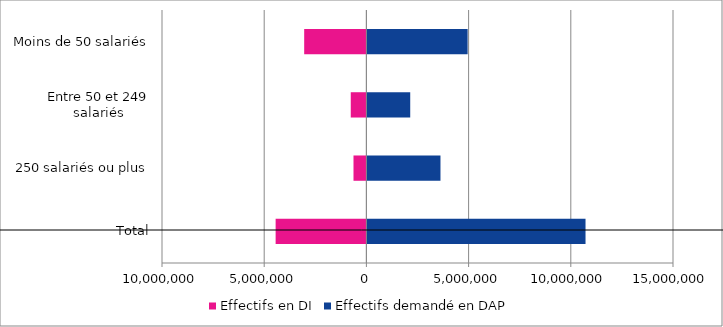
| Category | Effectifs en DI | Effectifs demandé en DAP |
|---|---|---|
| Total | -4440729 | 10720447 |
| 250 salariés ou plus | -631518 | 3623926 |
| Entre 50 et 249 salariés | -765380 | 2144051 |
| Moins de 50 salariés | -3043831 | 4952470 |